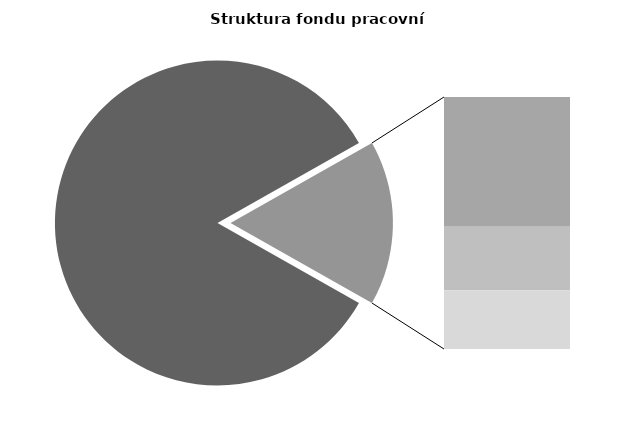
| Category | Series 0 |
|---|---|
| Průměrná měsíční odpracovaná doba bez přesčasu | 141.567 |
| Dovolená | 14.283 |
| Nemoc | 7.006 |
| Jiné | 6.457 |